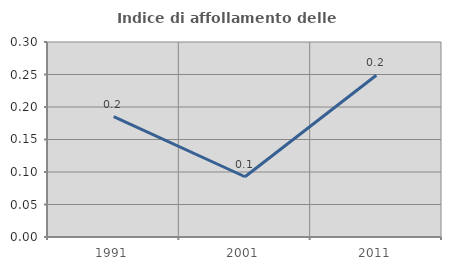
| Category | Indice di affollamento delle abitazioni  |
|---|---|
| 1991.0 | 0.185 |
| 2001.0 | 0.093 |
| 2011.0 | 0.249 |